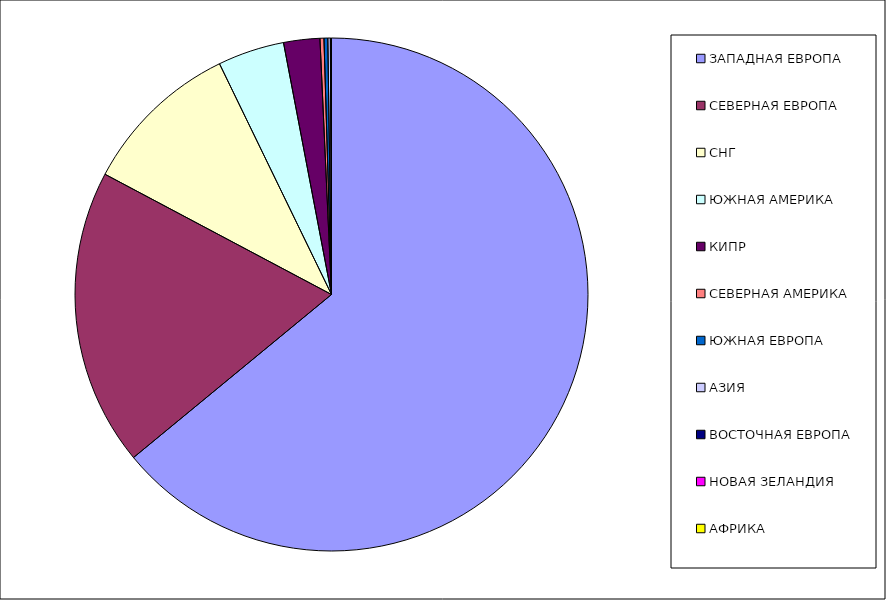
| Category | Оборот |
|---|---|
| ЗАПАДНАЯ ЕВРОПА | 0.64 |
| СЕВЕРНАЯ ЕВРОПА | 0.187 |
| СНГ | 0.1 |
| ЮЖНАЯ АМЕРИКА | 0.042 |
| КИПР | 0.023 |
| СЕВЕРНАЯ АМЕРИКА | 0.002 |
| ЮЖНАЯ ЕВРОПА | 0.002 |
| АЗИЯ | 0.002 |
| ВОСТОЧНАЯ ЕВРОПА | 0.001 |
| НОВАЯ ЗЕЛАНДИЯ | 0 |
| АФРИКА | 0 |